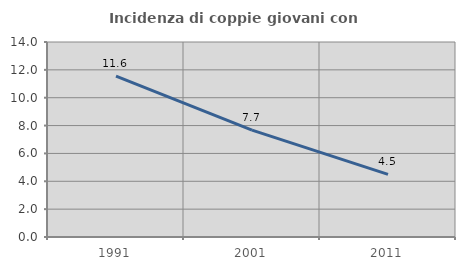
| Category | Incidenza di coppie giovani con figli |
|---|---|
| 1991.0 | 11.554 |
| 2001.0 | 7.668 |
| 2011.0 | 4.492 |